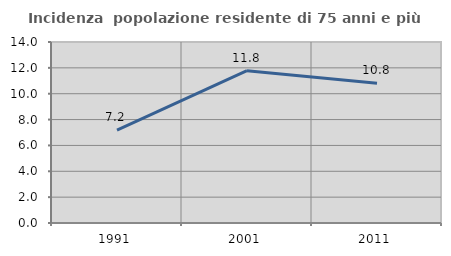
| Category | Incidenza  popolazione residente di 75 anni e più |
|---|---|
| 1991.0 | 7.178 |
| 2001.0 | 11.783 |
| 2011.0 | 10.811 |